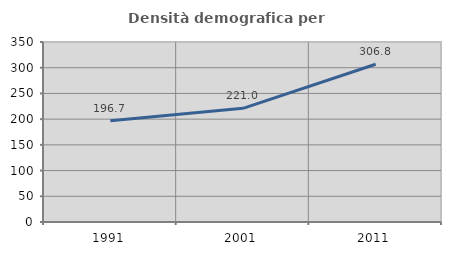
| Category | Densità demografica |
|---|---|
| 1991.0 | 196.665 |
| 2001.0 | 220.98 |
| 2011.0 | 306.797 |